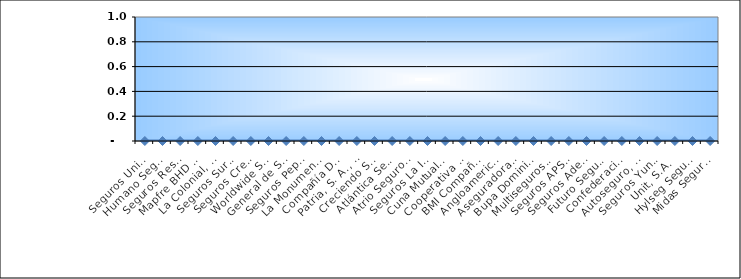
| Category | Series 0 |
|---|---|
| Seguros Universal, S. A. | 0 |
| Humano Seguros, S. A. | 0 |
| Seguros Reservas, S. A. | 0 |
| Mapfre BHD Compañía de Seguros | 0 |
| La Colonial, S. A., Compañia De Seguros | 0 |
| Seguros Sura, S.A. | 0 |
| Seguros Crecer, S. A. | 0 |
| Worldwide Seguros, S. A. | 0 |
| General de Seguros, S. A. | 0 |
| Seguros Pepín, S. A. | 0 |
| La Monumental de Seguros, S. A. | 0 |
| Compañía Dominicana de Seguros, C. por A. | 0 |
| Patria, S. A., Compañía de Seguros | 0 |
| Creciendo Seguros | 0 |
| Atlántica Seguros, S. A. | 0 |
| Atrio Seguros S. A. | 0 |
| Seguros La Internacional, S. A. | 0 |
| Cuna Mutual Insurance Society Dominicana | 0 |
| Cooperativa Nacional De Seguros, Inc  | 0 |
| BMI Compañía de Seguros, S. A. | 0 |
| Angloamericana de Seguros, S. A. | 0 |
| Aseguradora Agropecuaria Dominicana, S. A. | 0 |
| Bupa Dominicana, S. A. | 0 |
| Multiseguros Su, S.A. | 0 |
| Seguros APS, S.R.L. | 0 |
| Seguros Ademi, S.A. | 0 |
| Futuro Seguros | 0 |
| Confederación del Canadá Dominicana, S. A. | 0 |
| Autoseguro, S. A. | 0 |
| Seguros Yunen, S.A. | 0 |
| Unit, S.A. | 0 |
| Hylseg Seguros S.A | 0 |
| Midas Seguros, S.A. | 0 |